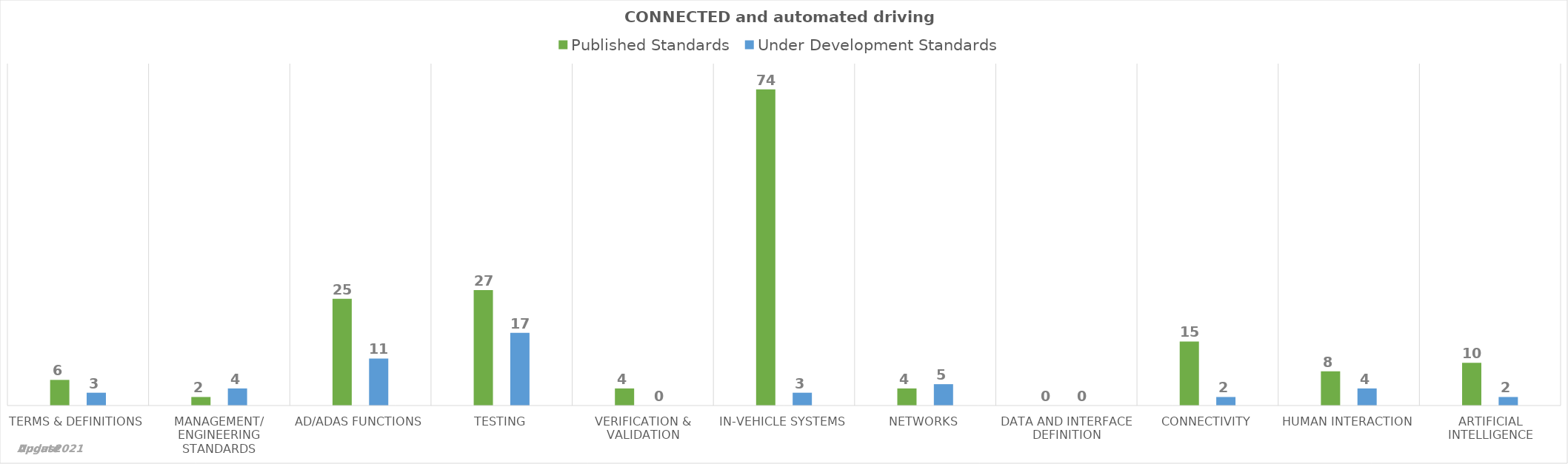
| Category | Published Standards | Under Development Standards |
|---|---|---|
| 0 | 6 | 3 |
| 1 | 2 | 4 |
| 2 | 25 | 11 |
| 3 | 27 | 17 |
| 4 | 4 | 0 |
| 5 | 74 | 3 |
| 6 | 4 | 5 |
| 7 | 0 | 0 |
| 8 | 15 | 2 |
| 9 | 8 | 4 |
| 10 | 10 | 2 |